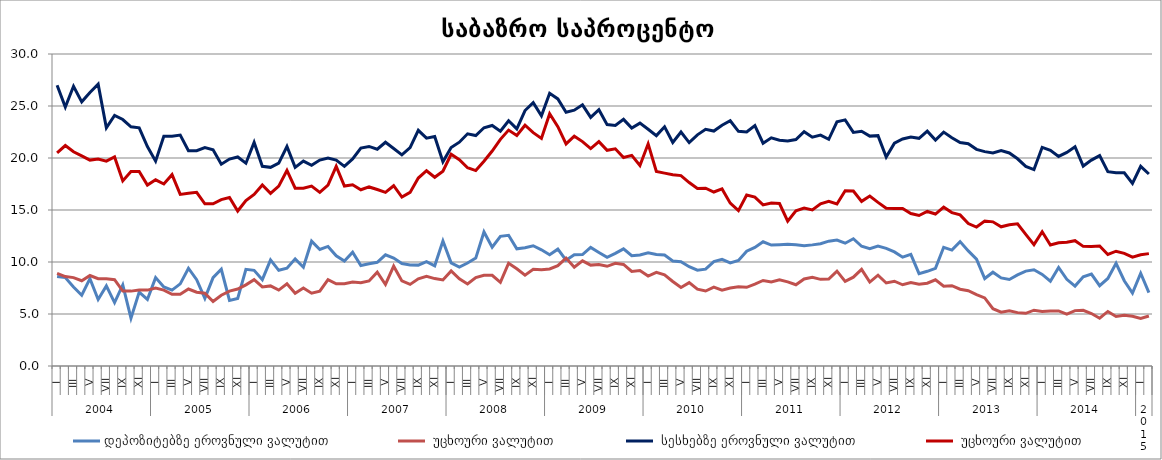
| Category | დეპოზიტებზე ეროვნული ვალუტით | დეპოზიტებზე უცხოური ვალუტით |  სესხებზე ეროვნული ვალუტით |  სესხებზე უცხოური ვალუტით |
|---|---|---|---|---|
| 0 | 8.6 | 8.9 | 27 | 20.5 |
| 1 | 8.5 | 8.6 | 24.9 | 21.2 |
| 2 | 7.6 | 8.5 | 26.9 | 20.6 |
| 3 | 6.8 | 8.2 | 25.4 | 20.2 |
| 4 | 8.4 | 8.7 | 26.3 | 19.8 |
| 5 | 6.4 | 8.4 | 27.1 | 19.9 |
| 6 | 7.7 | 8.4 | 22.9 | 19.7 |
| 7 | 6.1 | 8.3 | 24.1 | 20.1 |
| 8 | 7.8 | 7.2 | 23.7 | 17.8 |
| 9 | 4.6 | 7.2 | 23 | 18.7 |
| 10 | 7.1 | 7.3 | 22.9 | 18.7 |
| 11 | 6.4 | 7.3 | 21.1 | 17.4 |
| 12 | 8.5 | 7.5 | 19.7 | 17.9 |
| 13 | 7.6 | 7.3 | 22.1 | 17.5 |
| 14 | 7.3 | 6.9 | 22.1 | 18.4 |
| 15 | 7.9 | 6.9 | 22.2 | 16.5 |
| 16 | 9.4 | 7.4 | 20.7 | 16.6 |
| 17 | 8.3 | 7.1 | 20.7 | 16.7 |
| 18 | 6.5 | 7 | 21 | 15.6 |
| 19 | 8.5 | 6.2 | 20.8 | 15.6 |
| 20 | 9.3 | 6.8 | 19.4 | 16 |
| 21 | 6.3 | 7.2 | 19.9 | 16.2 |
| 22 | 6.5 | 7.4 | 20.1 | 14.9 |
| 23 | 9.3 | 7.8 | 19.5 | 15.9 |
| 24 | 9.2 | 8.3 | 21.5 | 16.5 |
| 25 | 8.3 | 7.6 | 19.2 | 17.4 |
| 26 | 10.2 | 7.7 | 19.1 | 16.6 |
| 27 | 9.2 | 7.3 | 19.5 | 17.3 |
| 28 | 9.4 | 7.9 | 21.1 | 18.8 |
| 29 | 10.3 | 7 | 19.1 | 17.1 |
| 30 | 9.5 | 7.5 | 19.7 | 17.1 |
| 31 | 12 | 7 | 19.3 | 17.3 |
| 32 | 11.2 | 7.2 | 19.8 | 16.7 |
| 33 | 11.5 | 8.3 | 20 | 17.4 |
| 34 | 10.6 | 7.9 | 19.8 | 19.2 |
| 35 | 10.1 | 7.9 | 19.2 | 17.3 |
| 36 | 10.931 | 8.065 | 19.914 | 17.427 |
| 37 | 9.659 | 8 | 20.957 | 16.948 |
| 38 | 9.829 | 8.178 | 21.11 | 17.216 |
| 39 | 9.968 | 9.017 | 20.845 | 16.966 |
| 40 | 10.692 | 7.838 | 21.515 | 16.698 |
| 41 | 10.375 | 9.598 | 20.913 | 17.334 |
| 42 | 9.854 | 8.187 | 20.298 | 16.239 |
| 43 | 9.721 | 7.847 | 21.007 | 16.691 |
| 44 | 9.7 | 8.383 | 22.661 | 18.071 |
| 45 | 10.029 | 8.618 | 21.911 | 18.776 |
| 46 | 9.638 | 8.405 | 22.064 | 18.149 |
| 47 | 12.024 | 8.277 | 19.636 | 18.735 |
| 48 | 9.921 | 9.137 | 21.002 | 20.354 |
| 49 | 9.519 | 8.38 | 21.519 | 19.831 |
| 50 | 9.905 | 7.883 | 22.328 | 19.065 |
| 51 | 10.377 | 8.496 | 22.158 | 18.793 |
| 52 | 12.888 | 8.724 | 22.91 | 19.686 |
| 53 | 11.419 | 8.718 | 23.129 | 20.674 |
| 54 | 12.465 | 8.041 | 22.575 | 21.792 |
| 55 | 12.567 | 9.883 | 23.586 | 22.683 |
| 56 | 11.271 | 9.345 | 22.801 | 22.171 |
| 57 | 11.367 | 8.74 | 24.565 | 23.151 |
| 58 | 11.562 | 9.296 | 25.317 | 22.44 |
| 59 | 11.174 | 9.249 | 24.06 | 21.881 |
| 60 | 10.694 | 9.327 | 26.225 | 24.264 |
| 61 | 11.235 | 9.643 | 25.683 | 23.008 |
| 62 | 10.174 | 10.375 | 24.407 | 21.357 |
| 63 | 10.7 | 9.5 | 24.6 | 22.1 |
| 64 | 10.718 | 10.112 | 25.11 | 21.579 |
| 65 | 11.4 | 9.7 | 23.9 | 20.9 |
| 66 | 10.92 | 9.755 | 24.644 | 21.577 |
| 67 | 10.451 | 9.586 | 23.212 | 20.738 |
| 68 | 10.824 | 9.871 | 23.129 | 20.882 |
| 69 | 11.266 | 9.763 | 23.715 | 20.05 |
| 70 | 10.601 | 9.091 | 22.884 | 20.248 |
| 71 | 10.668 | 9.175 | 23.353 | 19.284 |
| 72 | 10.878 | 8.643 | 22.769 | 21.363 |
| 73 | 10.717 | 8.997 | 22.15 | 18.71 |
| 74 | 10.671 | 8.763 | 23.007 | 18.548 |
| 75 | 10.097 | 8.129 | 21.499 | 18.381 |
| 76 | 10.023 | 7.542 | 22.499 | 18.308 |
| 77 | 9.549 | 8.016 | 21.478 | 17.639 |
| 78 | 9.21 | 7.391 | 22.226 | 17.062 |
| 79 | 9.312 | 7.21 | 22.756 | 17.1 |
| 80 | 10.044 | 7.587 | 22.589 | 16.729 |
| 81 | 10.252 | 7.286 | 23.152 | 17.025 |
| 82 | 9.914 | 7.492 | 23.578 | 15.659 |
| 83 | 10.153 | 7.61 | 22.567 | 14.933 |
| 84 | 11.04 | 7.567 | 22.508 | 16.448 |
| 85 | 11.405 | 7.87 | 23.12 | 16.245 |
| 86 | 11.947 | 8.222 | 21.419 | 15.495 |
| 87 | 11.633 | 8.08 | 21.936 | 15.667 |
| 88 | 11.667 | 8.291 | 21.708 | 15.619 |
| 89 | 11.708 | 8.087 | 21.633 | 13.934 |
| 90 | 11.65 | 7.811 | 21.775 | 14.92 |
| 91 | 11.552 | 8.37 | 22.533 | 15.184 |
| 92 | 11.647 | 8.526 | 21.996 | 15.009 |
| 93 | 11.763 | 8.33 | 22.195 | 15.595 |
| 94 | 12.006 | 8.356 | 21.797 | 15.834 |
| 95 | 12.104 | 9.122 | 23.476 | 15.574 |
| 96 | 11.807 | 8.134 | 23.665 | 16.848 |
| 97 | 12.237 | 8.538 | 22.459 | 16.83 |
| 98 | 11.513 | 9.292 | 22.57 | 15.829 |
| 99 | 11.273 | 8.074 | 22.104 | 16.345 |
| 100 | 11.537 | 8.733 | 22.148 | 15.733 |
| 101 | 11.307 | 7.982 | 20.087 | 15.168 |
| 102 | 10.97 | 8.15 | 21.42 | 15.137 |
| 103 | 10.461 | 7.811 | 21.824 | 15.15 |
| 104 | 10.729 | 8.033 | 22.02 | 14.665 |
| 105 | 8.887 | 7.859 | 21.891 | 14.472 |
| 106 | 9.107 | 7.958 | 22.579 | 14.858 |
| 107 | 9.393 | 8.289 | 21.723 | 14.612 |
| 108 | 11.414 | 7.668 | 22.491 | 15.267 |
| 109 | 11.145 | 7.721 | 21.943 | 14.749 |
| 110 | 11.96 | 7.38 | 21.484 | 14.533 |
| 111 | 11.069 | 7.234 | 21.377 | 13.698 |
| 112 | 10.275 | 6.856 | 20.835 | 13.365 |
| 113 | 8.409 | 6.545 | 20.613 | 13.936 |
| 114 | 9.02 | 5.508 | 20.486 | 13.862 |
| 115 | 8.473 | 5.179 | 20.707 | 13.383 |
| 116 | 8.318 | 5.319 | 20.481 | 13.588 |
| 117 | 8.757 | 5.132 | 19.925 | 13.67 |
| 118 | 9.127 | 5.067 | 19.199 | 12.658 |
| 119 | 9.257 | 5.368 | 18.89 | 11.674 |
| 120 | 8.802 | 5.25 | 21.028 | 12.906 |
| 121 | 8.149 | 5.279 | 20.744 | 11.641 |
| 122 | 9.476 | 5.297 | 20.15 | 11.841 |
| 123 | 8.334 | 4.985 | 20.54 | 11.909 |
| 124 | 7.684 | 5.325 | 21.08 | 12.051 |
| 125 | 8.57 | 5.352 | 19.223 | 11.504 |
| 126 | 8.837 | 5.047 | 19.795 | 11.499 |
| 127 | 7.723 | 4.596 | 20.228 | 11.543 |
| 128 | 8.42 | 5.244 | 18.683 | 10.726 |
| 129 | 9.879 | 4.762 | 18.577 | 11.036 |
| 130 | 8.2 | 4.869 | 18.58 | 10.828 |
| 131 | 7.007 | 4.779 | 17.55 | 10.462 |
| 132 | 8.918 | 4.569 | 19.2 | 10.7 |
| 133 | 7.061 | 4.811 | 18.46 | 10.805 |